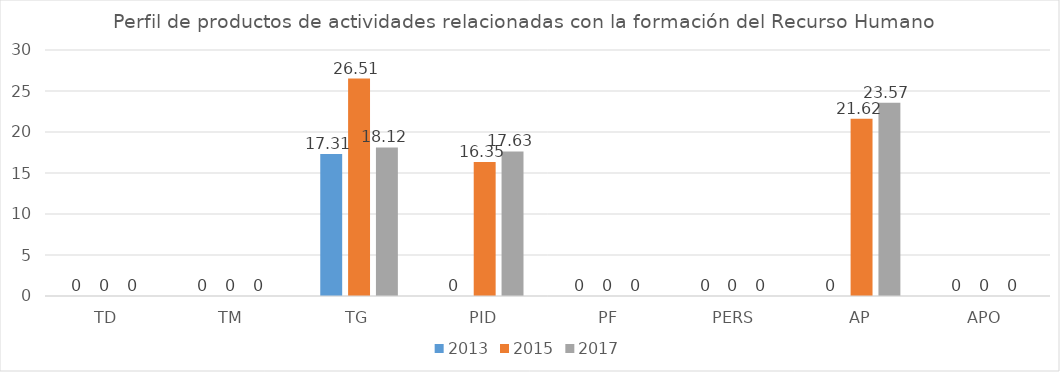
| Category | 2013 | 2015 | 2017 |
|---|---|---|---|
| TD | 0 | 0 | 0 |
| TM | 0 | 0 | 0 |
| TG | 17.31 | 26.51 | 18.12 |
| PID | 0 | 16.35 | 17.63 |
| PF | 0 | 0 | 0 |
| PERS | 0 | 0 | 0 |
| AP | 0 | 21.62 | 23.57 |
| APO | 0 | 0 | 0 |